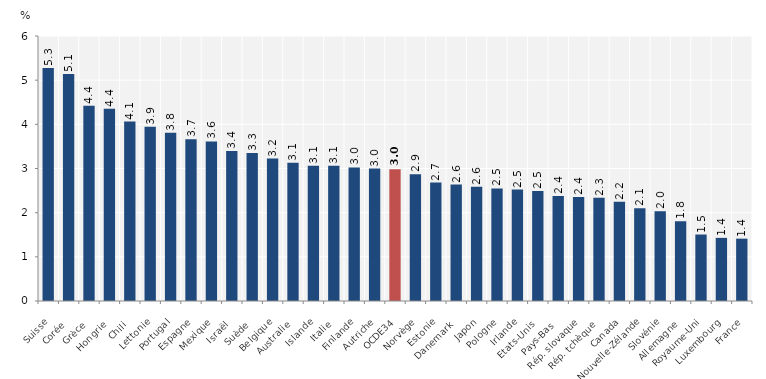
| Category | Series 0 |
|---|---|
| Suisse | 5.278 |
| Corée | 5.142 |
| Grèce | 4.423 |
| Hongrie | 4.352 |
| Chili | 4.063 |
| Lettonie | 3.945 |
| Portugal | 3.809 |
| Espagne | 3.66 |
| Mexique | 3.613 |
| Israël | 3.395 |
| Suède | 3.349 |
| Belgique | 3.225 |
| Australie | 3.128 |
| Islande | 3.064 |
| Italie | 3.06 |
| Finlande | 3.023 |
| Autriche | 2.998 |
| OCDE34 | 2.984 |
| Norvège | 2.872 |
| Estonie | 2.68 |
| Danemark | 2.638 |
| Japon | 2.587 |
| Pologne | 2.549 |
| Irlande | 2.523 |
| Etats-Unis | 2.493 |
| Pays-Bas | 2.379 |
| Rép. slovaque | 2.352 |
| Rép. tchèque | 2.336 |
| Canada | 2.249 |
| Nouvelle-Zélande | 2.099 |
| Slovénie | 2.031 |
| Allemagne | 1.806 |
| Royaume-Uni | 1.505 |
| Luxembourg | 1.429 |
| France | 1.411 |